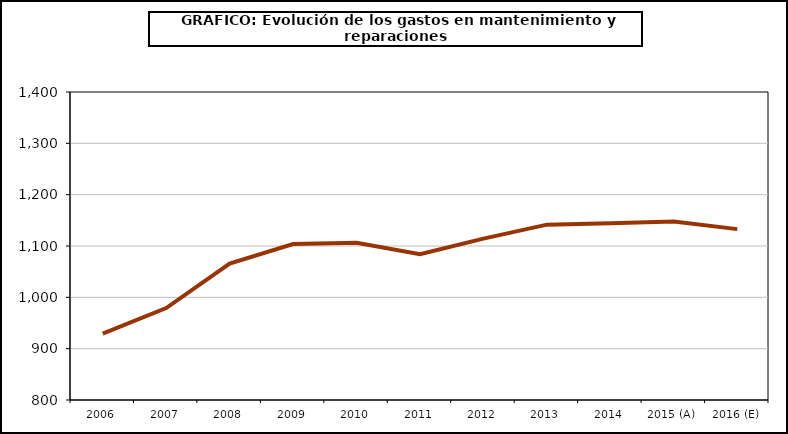
| Category | Series 0 |
|---|---|
| 2006 | 929.437 |
| 2007 | 979.04 |
| 2008 | 1065.637 |
| 2009 | 1103.67 |
| 2010 | 1106.325 |
| 2011 | 1083.98 |
| 2012 | 1114.377 |
| 2013 | 1141.575 |
| 2014 | 1144.341 |
| 2015 (A) | 1147.821 |
| 2016 (E) | 1132.883 |